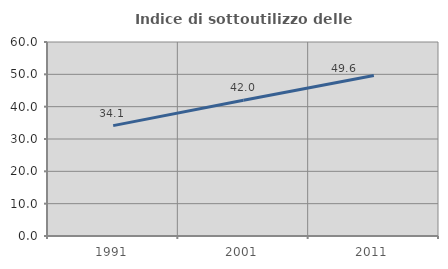
| Category | Indice di sottoutilizzo delle abitazioni  |
|---|---|
| 1991.0 | 34.14 |
| 2001.0 | 41.969 |
| 2011.0 | 49.649 |